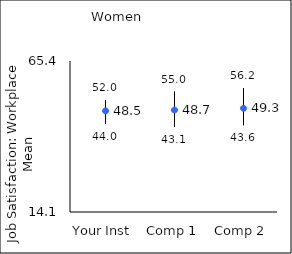
| Category | 25th percentile | 75th percentile | Mean |
|---|---|---|---|
| Your Inst | 44 | 52 | 48.46 |
| Comp 1 | 43.1 | 55 | 48.74 |
| Comp 2 | 43.6 | 56.2 | 49.34 |